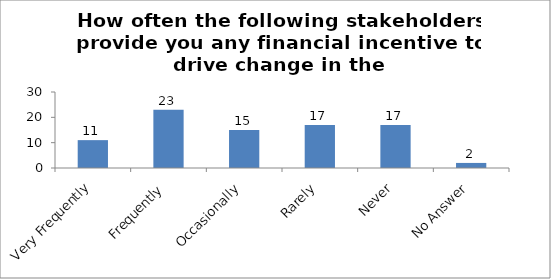
| Category | How often the following stakeholders provide you any financial incentive to drive change in the society?(Employers) |
|---|---|
| Very Frequently | 11 |
| Frequently | 23 |
| Occasionally | 15 |
| Rarely | 17 |
| Never | 17 |
| No Answer | 2 |